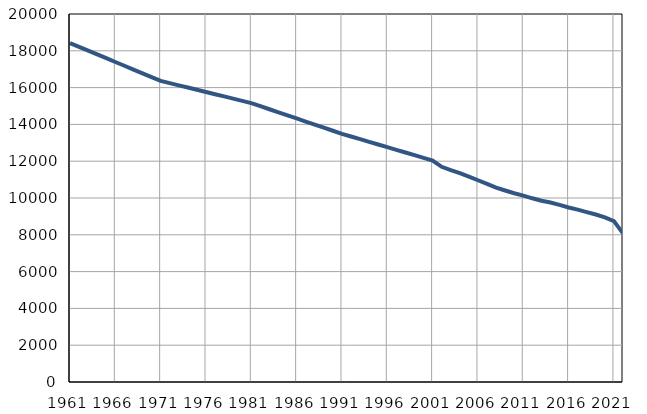
| Category | Број
становника |
|---|---|
| 1961.0 | 18418 |
| 1962.0 | 18213 |
| 1963.0 | 18007 |
| 1964.0 | 17802 |
| 1965.0 | 17597 |
| 1966.0 | 17391 |
| 1967.0 | 17186 |
| 1968.0 | 16981 |
| 1969.0 | 16776 |
| 1970.0 | 16570 |
| 1971.0 | 16365 |
| 1972.0 | 16244 |
| 1973.0 | 16124 |
| 1974.0 | 16003 |
| 1975.0 | 15882 |
| 1976.0 | 15762 |
| 1977.0 | 15641 |
| 1978.0 | 15520 |
| 1979.0 | 15399 |
| 1980.0 | 15279 |
| 1981.0 | 15158 |
| 1982.0 | 14991 |
| 1983.0 | 14824 |
| 1984.0 | 14657 |
| 1985.0 | 14491 |
| 1986.0 | 14323 |
| 1987.0 | 14156 |
| 1988.0 | 13989 |
| 1989.0 | 13822 |
| 1990.0 | 13655 |
| 1991.0 | 13488 |
| 1992.0 | 13343 |
| 1993.0 | 13198 |
| 1994.0 | 13053 |
| 1995.0 | 12908 |
| 1996.0 | 12763 |
| 1997.0 | 12618 |
| 1998.0 | 12473 |
| 1999.0 | 12328 |
| 2000.0 | 12183 |
| 2001.0 | 12038 |
| 2002.0 | 11697 |
| 2003.0 | 11515 |
| 2004.0 | 11355 |
| 2005.0 | 11167 |
| 2006.0 | 10964 |
| 2007.0 | 10765 |
| 2008.0 | 10566 |
| 2009.0 | 10407 |
| 2010.0 | 10258 |
| 2011.0 | 10133 |
| 2012.0 | 9984 |
| 2013.0 | 9854 |
| 2014.0 | 9758 |
| 2015.0 | 9623 |
| 2016.0 | 9487 |
| 2017.0 | 9367 |
| 2018.0 | 9234 |
| 2019.0 | 9104 |
| 2020.0 | 8944 |
| 2021.0 | 8741 |
| 2022.0 | 8077 |